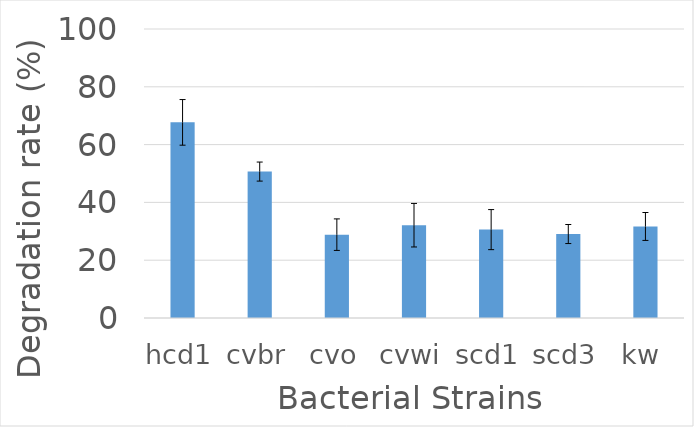
| Category | Series 0 |
|---|---|
| hcd1 | 67.693 |
| cvbr | 50.666 |
| cvo | 28.836 |
| cvwi | 32.111 |
| scd1 | 30.583 |
| scd3 | 29.055 |
| kw | 31.674 |